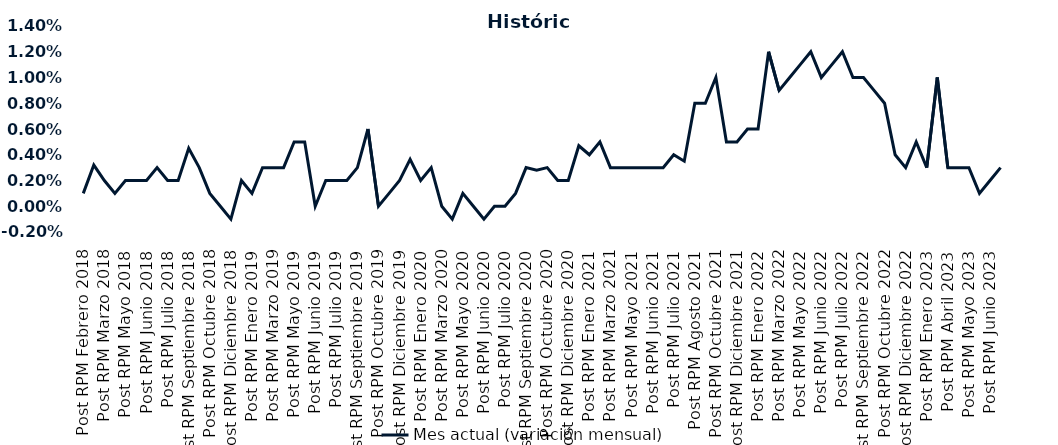
| Category | Mes actual (variación mensual)  |
|---|---|
| Post RPM Febrero 2018 | 0.001 |
| Pre RPM Marzo 2018 | 0.003 |
| Post RPM Marzo 2018 | 0.002 |
| Pre RPM Mayo 2018 | 0.001 |
| Post RPM Mayo 2018 | 0.002 |
| Pre RPM Junio 2018 | 0.002 |
| Post RPM Junio 2018 | 0.002 |
| Pre RPM Julio 2018 | 0.003 |
| Post RPM Julio 2018 | 0.002 |
| Pre RPM Septiembre 2018 | 0.002 |
| Post RPM Septiembre 2018 | 0.004 |
| Pre RPM Octubre 2018 | 0.003 |
| Post RPM Octubre 2018 | 0.001 |
| Pre RPM Diciembre 2018 | 0 |
| Post RPM Diciembre 2018 | -0.001 |
| Pre RPM Enero 2019 | 0.002 |
| Post RPM Enero 2019 | 0.001 |
| Pre RPM Marzo 2019 | 0.003 |
| Post RPM Marzo 2019 | 0.003 |
| Pre RPM Mayo 2019 | 0.003 |
| Post RPM Mayo 2019 | 0.005 |
| Pre RPM Junio 2019 | 0.005 |
| Post RPM Junio 2019 | 0 |
| Pre RPM Julio 2019 | 0.002 |
| Post RPM Julio 2019 | 0.002 |
| Pre RPM Septiembre 2019 | 0.002 |
| Post RPM Septiembre 2019 | 0.003 |
| Pre RPM Octubre 2019 | 0.006 |
| Post RPM Octubre 2019 | 0 |
| Pre RPM Diciembre 2019 | 0.001 |
| Post RPM Diciembre 2019 | 0.002 |
| Pre RPM Enero 2020 | 0.004 |
| Post RPM Enero 2020 | 0.002 |
| Pre RPM Marzo 2020 | 0.003 |
| Post RPM Marzo 2020 | 0 |
| Pre RPM Mayo 2020 | -0.001 |
| Post RPM Mayo 2020 | 0.001 |
| Pre RPM Junio 2020 | 0 |
| Post RPM Junio 2020 | -0.001 |
| Pre RPM Julio 2020 | 0 |
| Post RPM Julio 2020 | 0 |
| Pre RPM Septiembre 2020 | 0.001 |
| Post RPM Septiembre 2020 | 0.003 |
| Pre RPM Octubre 2020 | 0.003 |
| Post RPM Octubre 2020 | 0.003 |
| Pre RPM Diciembre 2020 | 0.002 |
| Post RPM Diciembre 2020 | 0.002 |
| Pre RPM Enero 2021 | 0.005 |
| Post RPM Enero 2021 | 0.004 |
| Pre RPM Marzo 2021 | 0.005 |
| Post RPM Marzo 2021 | 0.003 |
| Pre RPM Mayo 2021 | 0.003 |
| Post RPM Mayo 2021 | 0.003 |
| Pre RPM Junio 2021 | 0.003 |
| Post RPM Junio 2021 | 0.003 |
| Pre RPM Julio 2021 | 0.003 |
| Post RPM Julio 2021 | 0.004 |
| Pre RPM Agosto 2021 | 0.004 |
| Post RPM Agosto 2021 | 0.008 |
| Pre RPM Octubre 2021 | 0.008 |
| Post RPM Octubre 2021 | 0.01 |
| Pre RPM Diciembre 2021 | 0.005 |
| Post RPM Diciembre 2021 | 0.005 |
| Pre RPM Enero 2022 | 0.006 |
| Post RPM Enero 2022 | 0.006 |
| Pre RPM Marzo 2022 | 0.012 |
| Post RPM Marzo 2022 | 0.009 |
| Pre RPM Mayo 2022 | 0.01 |
| Post RPM Mayo 2022 | 0.011 |
| Pre RPM Junio 2022 | 0.012 |
| Post RPM Junio 2022 | 0.01 |
| Pre RPM Julio 2022 | 0.011 |
| Post RPM Julio 2022 | 0.012 |
| Pre RPM Septiembre 2022 | 0.01 |
| Post RPM Septiembre 2022 | 0.01 |
| Pre RPM Octubre 2022 | 0.009 |
| Post RPM Octubre 2022 | 0.008 |
| Pre RPM Diciembre 2022 | 0.004 |
| Post RPM Diciembre 2022 | 0.003 |
| Pre RPM Enero 2023 | 0.005 |
| Post RPM Enero 2023 | 0.003 |
| Pre RPM Abril 2023 | 0.01 |
| Post RPM Abril 2023 | 0.003 |
| Pre RPM Mayo 2023 | 0.003 |
| Post RPM Mayo 2023 | 0.003 |
| Pre RPM Junio 2023 | 0.001 |
| Post RPM Junio 2023 | 0.002 |
| Pre RPM Julio 2023 | 0.003 |